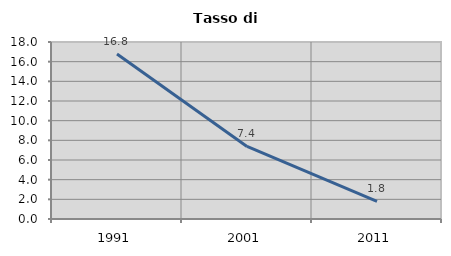
| Category | Tasso di disoccupazione   |
|---|---|
| 1991.0 | 16.779 |
| 2001.0 | 7.377 |
| 2011.0 | 1.802 |